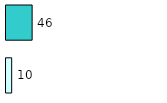
| Category | Series 0 | Series 1 |
|---|---|---|
| 0 | 10 | 46 |